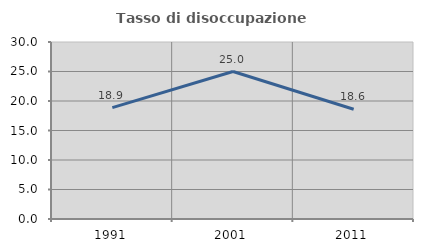
| Category | Tasso di disoccupazione giovanile  |
|---|---|
| 1991.0 | 18.868 |
| 2001.0 | 25 |
| 2011.0 | 18.605 |